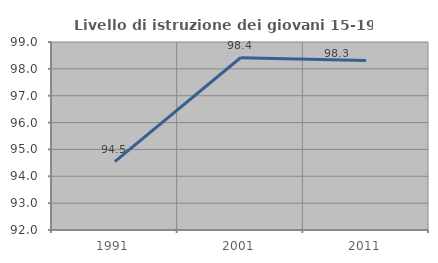
| Category | Livello di istruzione dei giovani 15-19 anni |
|---|---|
| 1991.0 | 94.549 |
| 2001.0 | 98.413 |
| 2011.0 | 98.31 |